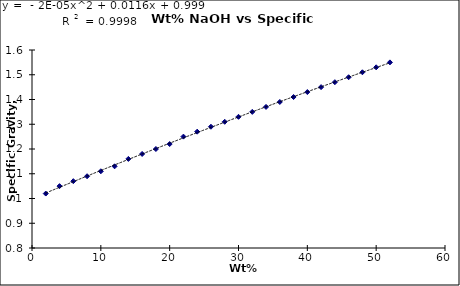
| Category | Series 0 |
|---|---|
| 2.0 | 1.02 |
| 4.0 | 1.05 |
| 6.0 | 1.07 |
| 8.0 | 1.09 |
| 10.0 | 1.11 |
| 12.0 | 1.13 |
| 14.0 | 1.16 |
| 16.0 | 1.18 |
| 18.0 | 1.2 |
| 20.0 | 1.22 |
| 22.0 | 1.25 |
| 24.0 | 1.27 |
| 26.0 | 1.29 |
| 28.0 | 1.31 |
| 30.0 | 1.33 |
| 32.0 | 1.35 |
| 34.0 | 1.37 |
| 36.0 | 1.39 |
| 38.0 | 1.41 |
| 40.0 | 1.43 |
| 42.0 | 1.45 |
| 44.0 | 1.47 |
| 46.0 | 1.49 |
| 48.0 | 1.51 |
| 50.0 | 1.53 |
| 52.0 | 1.55 |